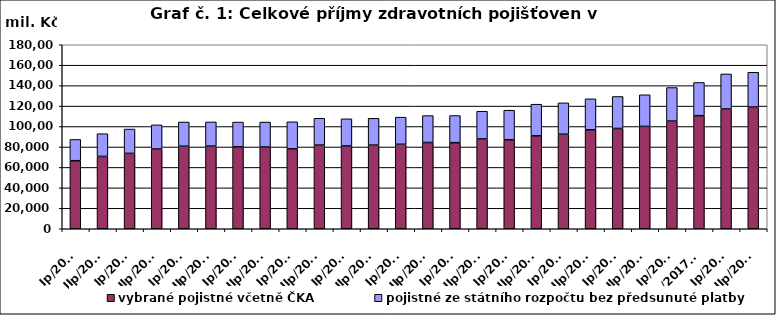
| Category | vybrané pojistné včetně ČKA | pojistné ze státního rozpočtu bez předsunuté platby |
|---|---|---|
| Ip/2006 | 66573.864 | 20793.909 |
| IIp/2006 | 70767.249 | 22216.553 |
| Ip/2007 | 73717.514 | 23848.343 |
| IIp/2007 | 78002.741 | 23632.262 |
| Ip/2008 | 80760.584 | 23669.967 |
| IIp/2008 | 80883.322 | 23610.728 |
| Ip/2009 | 80153.037 | 24239.226 |
| IIp/2009 | 79959.867 | 24445.733 |
| Ip/2010 | 78164.225 | 26486.11 |
| IIp/2010 | 81846.894 | 26220.675 |
| Ip/2011 | 81025.152 | 26519.003 |
| IIp/2011 | 81829.514 | 26206.267 |
| Ip/2012 | 82644.095 | 26526.738 |
| IIp/2012 | 84366.651 | 26347.951 |
| Ip/2013 | 84211.567 | 26574.921 |
| IIp/2013 | 87850.388 | 27101.376 |
| Ip/2014 | 87081.705 | 28902.722 |
| IIp/2014 | 90887.501 | 30964.468 |
| Ip/2015 | 92502.478 | 30659.689 |
| IIp/2015 | 96837.338 | 30284.703 |
| Ip/2016 | 98089.579 | 31309.421 |
| IIp/2016 | 100135.265 | 30944.105 |
| Ip/2017 | 105356.212 | 32802.787 |
| IIp/2017 *) | 110643.788 | 32450.77 |
| Ip/2018 | 117147.402 | 34300.507 |
| IIp/2018 | 119061.49 | 34058.935 |